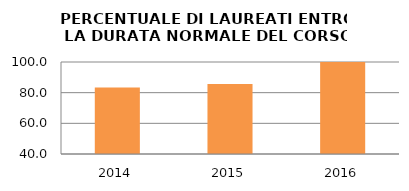
| Category | 2014 2015 2016 |
|---|---|
| 2014.0 | 83.333 |
| 2015.0 | 85.714 |
| 2016.0 | 100 |